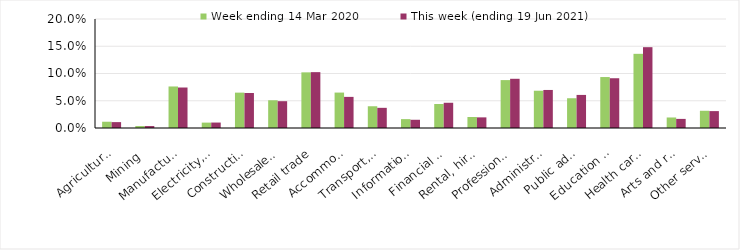
| Category | Week ending 14 Mar 2020 | This week (ending 19 Jun 2021) |
|---|---|---|
| Agriculture, forestry and fishing | 0.012 | 0.011 |
| Mining | 0.004 | 0.004 |
| Manufacturing | 0.076 | 0.074 |
| Electricity, gas, water and waste services | 0.01 | 0.01 |
| Construction | 0.065 | 0.064 |
| Wholesale trade | 0.051 | 0.049 |
| Retail trade | 0.102 | 0.102 |
| Accommodation and food services | 0.065 | 0.057 |
| Transport, postal and warehousing | 0.04 | 0.037 |
| Information media and telecommunications | 0.016 | 0.015 |
| Financial and insurance services | 0.044 | 0.046 |
| Rental, hiring and real estate services | 0.02 | 0.02 |
| Professional, scientific and technical services | 0.088 | 0.09 |
| Administrative and support services | 0.068 | 0.07 |
| Public administration and safety | 0.055 | 0.061 |
| Education and training | 0.094 | 0.091 |
| Health care and social assistance | 0.136 | 0.148 |
| Arts and recreation services | 0.019 | 0.017 |
| Other services | 0.032 | 0.031 |